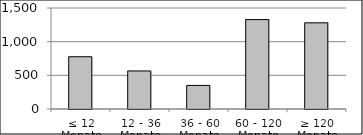
| Category | Volumen |
|---|---|
| ≤ 12 Monate | 776074056.54 |
| 12 - 36 Monate | 565109252.71 |
| 36 - 60 Monate | 350132103.21 |
| 60 - 120 Monate | 1327999224.781 |
| ≥ 120 Monate | 1279838173.221 |